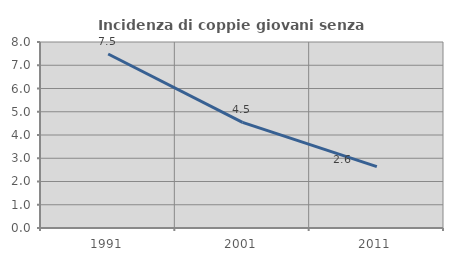
| Category | Incidenza di coppie giovani senza figli |
|---|---|
| 1991.0 | 7.484 |
| 2001.0 | 4.545 |
| 2011.0 | 2.643 |